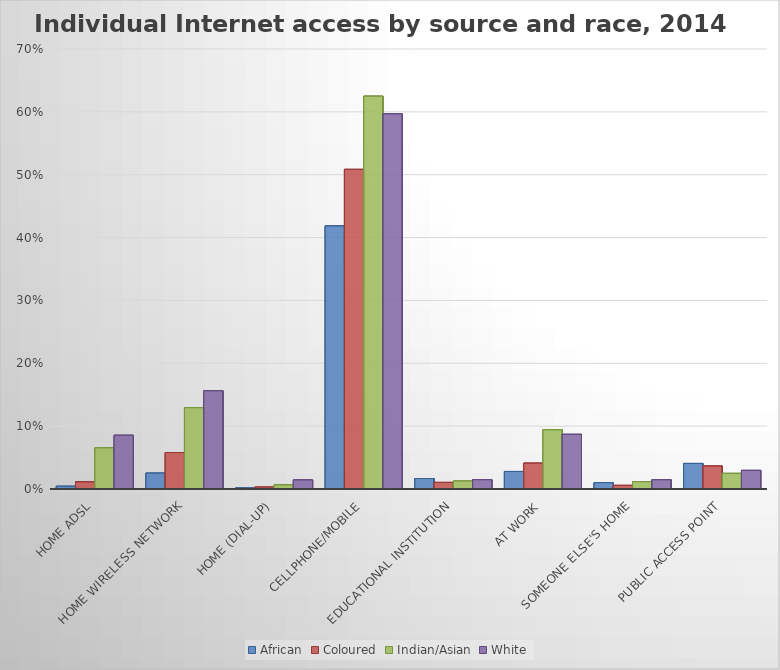
| Category | African | Coloured | Indian/Asian | White |
|---|---|---|---|---|
| Home ADSL | 0.004 | 0.011 | 0.066 | 0.086 |
| Home wireless network | 0.025 | 0.058 | 0.129 | 0.156 |
| Home (dial-up) | 0.002 | 0.003 | 0.007 | 0.015 |
| Cellphone/mobile | 0.419 | 0.509 | 0.625 | 0.597 |
| Educational institution | 0.017 | 0.011 | 0.013 | 0.015 |
| At work | 0.028 | 0.041 | 0.094 | 0.087 |
| Someone else's home | 0.01 | 0.006 | 0.012 | 0.015 |
| Public access point | 0.041 | 0.037 | 0.025 | 0.03 |